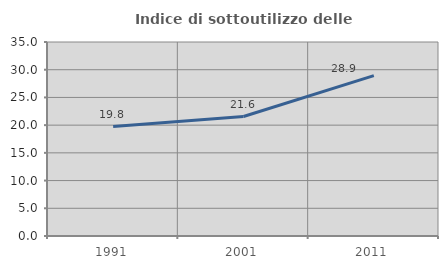
| Category | Indice di sottoutilizzo delle abitazioni  |
|---|---|
| 1991.0 | 19.754 |
| 2001.0 | 21.554 |
| 2011.0 | 28.936 |